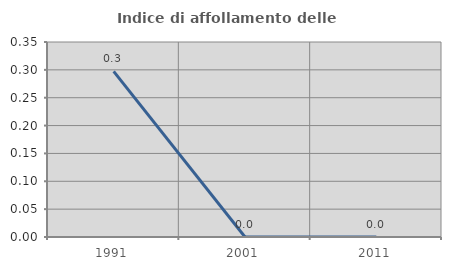
| Category | Indice di affollamento delle abitazioni  |
|---|---|
| 1991.0 | 0.297 |
| 2001.0 | 0 |
| 2011.0 | 0 |